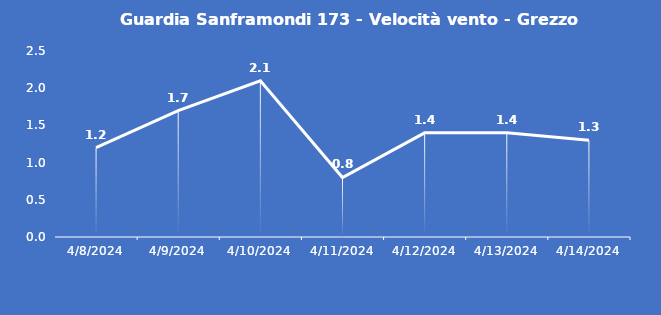
| Category | Guardia Sanframondi 173 - Velocità vento - Grezzo (m/s) |
|---|---|
| 4/8/24 | 1.2 |
| 4/9/24 | 1.7 |
| 4/10/24 | 2.1 |
| 4/11/24 | 0.8 |
| 4/12/24 | 1.4 |
| 4/13/24 | 1.4 |
| 4/14/24 | 1.3 |